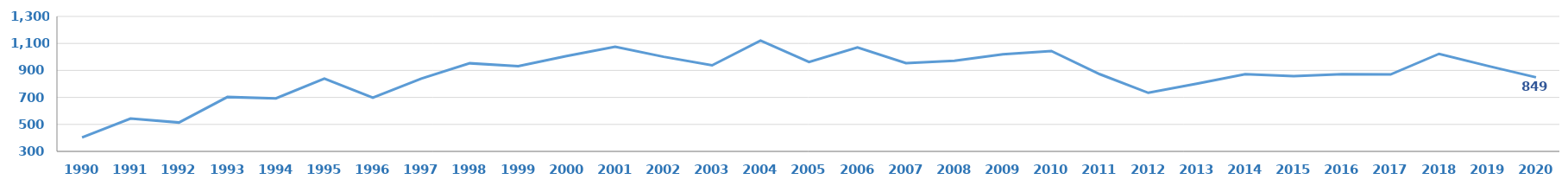
| Category | BEP |
|---|---|
| 1990.0 | 403 |
| 1991.0 | 543 |
| 1992.0 | 514 |
| 1993.0 | 703 |
| 1994.0 | 693 |
| 1995.0 | 840 |
| 1996.0 | 698 |
| 1997.0 | 839 |
| 1998.0 | 953 |
| 1999.0 | 932 |
| 2000.0 | 1007 |
| 2001.0 | 1076 |
| 2002.0 | 1001 |
| 2003.0 | 938 |
| 2004.0 | 1121 |
| 2005.0 | 963 |
| 2006.0 | 1071 |
| 2007.0 | 954 |
| 2008.0 | 972 |
| 2009.0 | 1020 |
| 2010.0 | 1044 |
| 2011.0 | 872 |
| 2012.0 | 734 |
| 2013.0 | 802 |
| 2014.0 | 872 |
| 2015.0 | 857 |
| 2016.0 | 872 |
| 2017.0 | 870 |
| 2018.0 | 1023 |
| 2019.0 | 934 |
| 2020.0 | 849 |